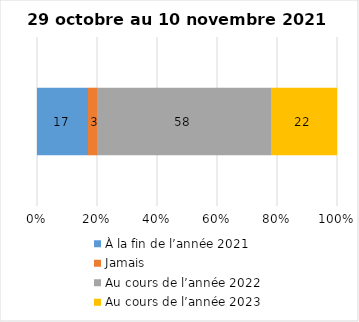
| Category | À la fin de l’année 2021 | Jamais | Au cours de l’année 2022 | Au cours de l’année 2023 |
|---|---|---|---|---|
| 0 | 17 | 3 | 58 | 22 |